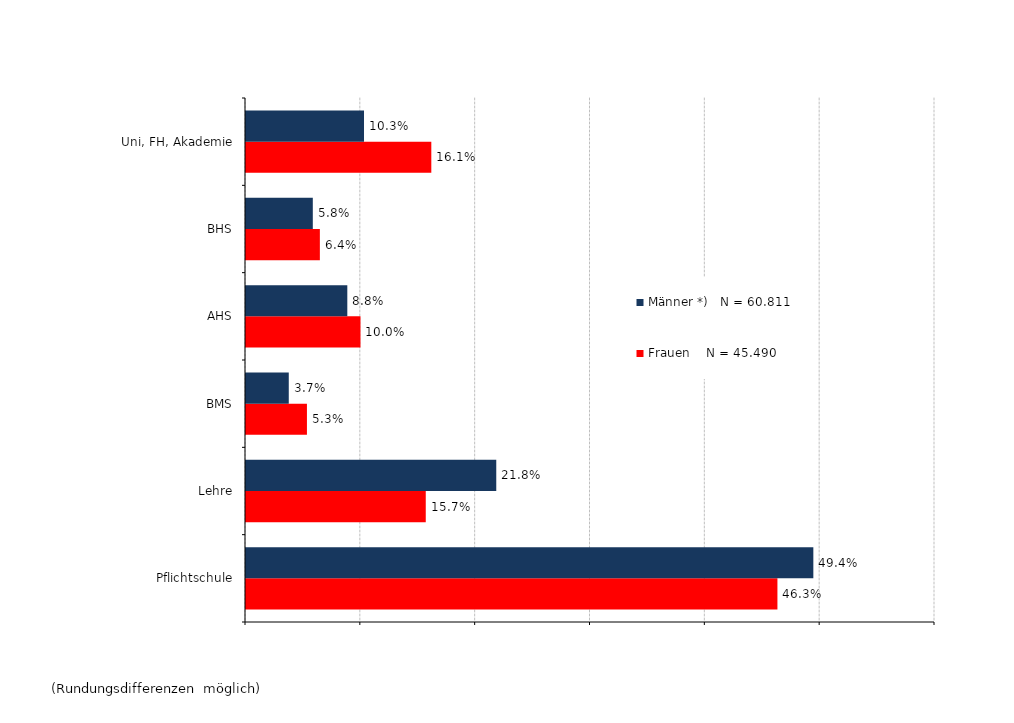
| Category | Frauen    N = 45.490 | Männer *)   N = 60.811 |
|---|---|---|
| Pflichtschule | 0.463 | 0.494 |
| Lehre | 0.157 | 0.218 |
| BMS | 0.053 | 0.037 |
| AHS | 0.1 | 0.088 |
| BHS | 0.064 | 0.058 |
| Uni, FH, Akademie | 0.161 | 0.103 |